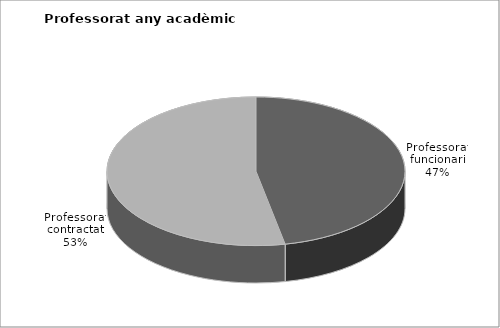
| Category | Series 0 |
|---|---|
| Professorat funcionari | 1303 |
| Professorat contractat | 1477 |